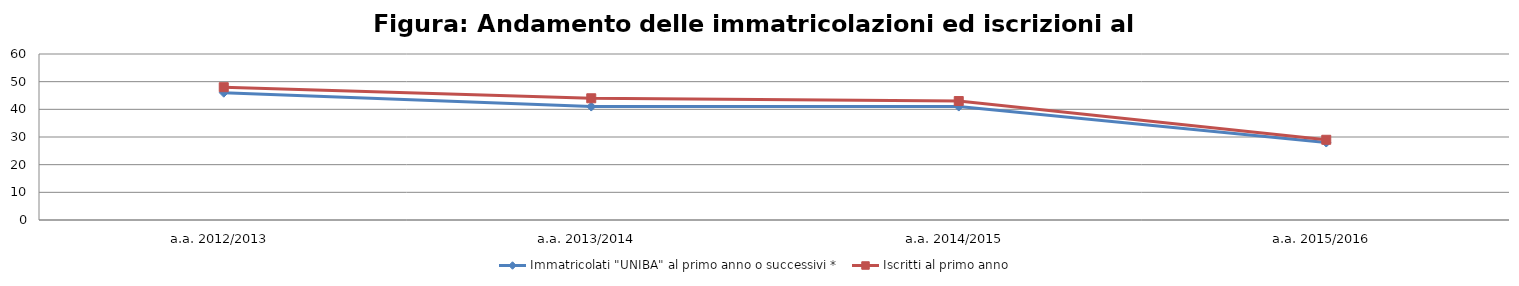
| Category | Immatricolati "UNIBA" al primo anno o successivi * | Iscritti al primo anno  |
|---|---|---|
| a.a. 2012/2013 | 46 | 48 |
| a.a. 2013/2014 | 41 | 44 |
| a.a. 2014/2015 | 41 | 43 |
| a.a. 2015/2016 | 28 | 29 |